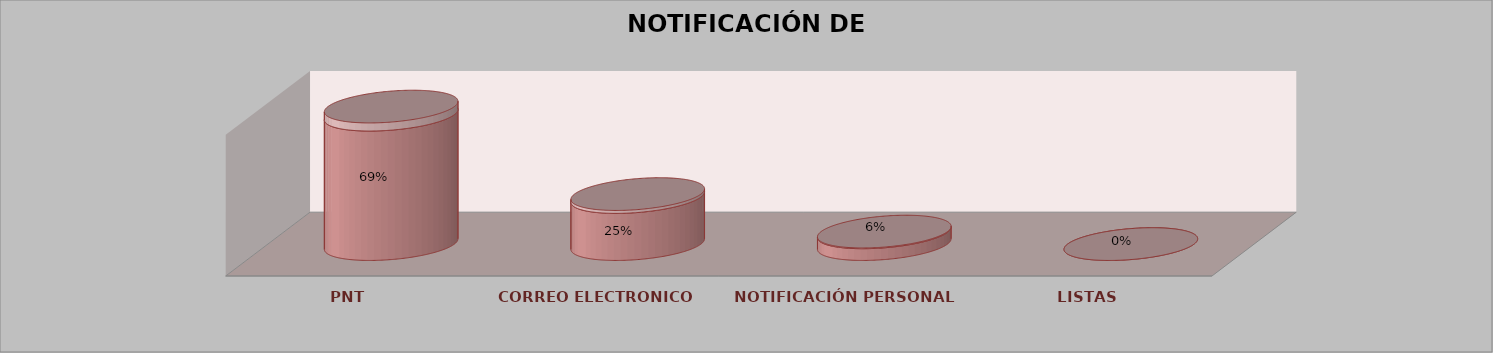
| Category | Series 0 | Series 1 | Series 2 | Series 3 | Series 4 |
|---|---|---|---|---|---|
| PNT |  |  |  | 11 | 0.688 |
| CORREO ELECTRONICO |  |  |  | 4 | 0.25 |
| NOTIFICACIÓN PERSONAL |  |  |  | 1 | 0.062 |
| LISTAS |  |  |  | 0 | 0 |